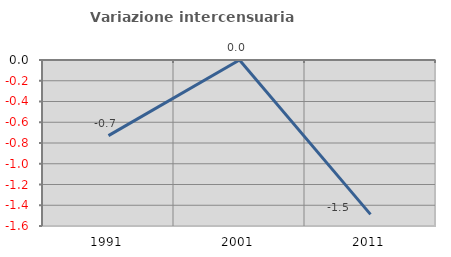
| Category | Variazione intercensuaria annua |
|---|---|
| 1991.0 | -0.729 |
| 2001.0 | 0 |
| 2011.0 | -1.488 |